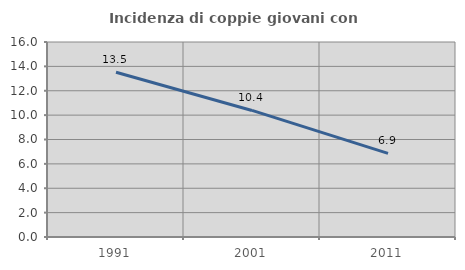
| Category | Incidenza di coppie giovani con figli |
|---|---|
| 1991.0 | 13.523 |
| 2001.0 | 10.385 |
| 2011.0 | 6.867 |